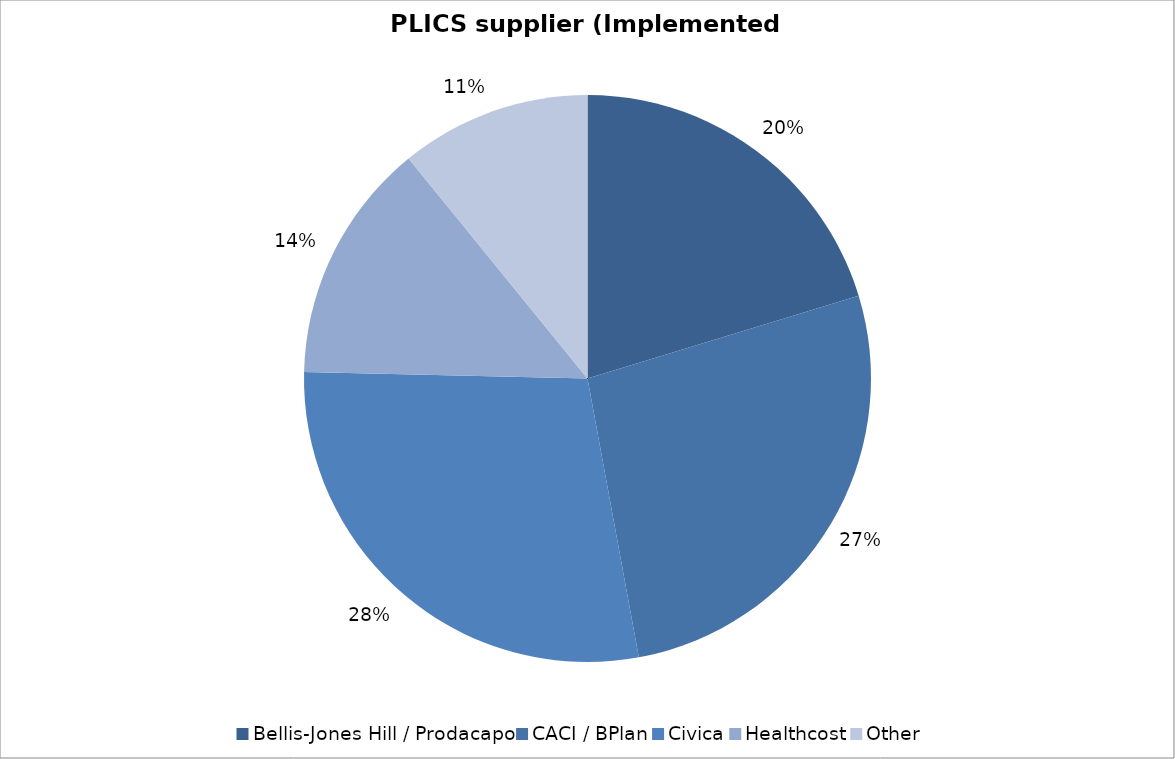
| Category | Series 0 |
|---|---|
| Bellis-Jones Hill / Prodacapo | 28 |
| CACI / BPlan | 37 |
| Civica | 39 |
| Healthcost | 19 |
| Other | 15 |